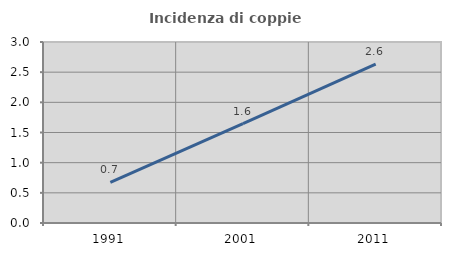
| Category | Incidenza di coppie miste |
|---|---|
| 1991.0 | 0.674 |
| 2001.0 | 1.648 |
| 2011.0 | 2.633 |